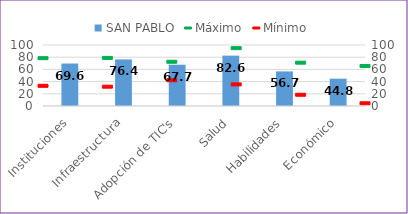
| Category | SAN PABLO |
|---|---|
| Instituciones | 69.632 |
| Infraestructura | 76.351 |
| Adopción de TIC's | 67.672 |
| Salud | 82.581 |
| Habilidades | 56.7 |
| Económico | 44.816 |